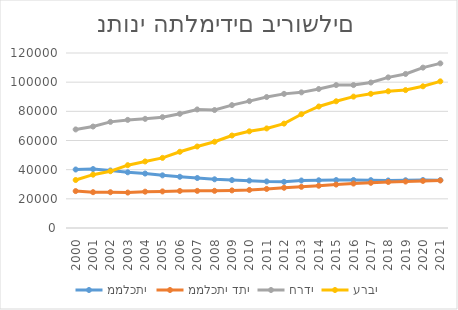
| Category | ממלכתי | ממלכתי דתי | חרדי | ערבי |
|---|---|---|---|---|
| 2000.0 | 40114 | 25312 | 67589 | 32911 |
| 2001.0 | 40411 | 24559 | 69573 | 36564 |
| 2002.0 | 39430 | 24532 | 72772 | 38938 |
| 2003.0 | 38199 | 24298 | 74134 | 43069 |
| 2004.0 | 37350 | 24911 | 74847 | 45623 |
| 2005.0 | 36107 | 25087 | 76012 | 48088 |
| 2006.0 | 35124 | 25411 | 78300 | 52263 |
| 2007.0 | 34279 | 25461 | 81286 | 55879 |
| 2008.0 | 33397 | 25482 | 80894 | 59133 |
| 2009.0 | 32851 | 25780 | 84259 | 63409 |
| 2010.0 | 32482 | 26095 | 86996 | 66288 |
| 2011.0 | 31921 | 26772 | 89808 | 68271 |
| 2012.0 | 31663 | 27601 | 91972 | 71581 |
| 2013.0 | 32564 | 28246 | 93012 | 78016 |
| 2014.0 | 32727 | 28973 | 95322 | 83314 |
| 2015.0 | 32874 | 29790 | 98022 | 86897 |
| 2016.0 | 32921 | 30474 | 98022 | 90083 |
| 2017.0 | 32811 | 30982 | 99759 | 92018 |
| 2018.0 | 32578 | 31576 | 103285 | 93751 |
| 2019.0 | 32735 | 31859 | 105632 | 94574 |
| 2020.0 | 32886 | 32283 | 109975 | 97163 |
| 2021.0 | 32795 | 32608 | 112879 | 100551 |